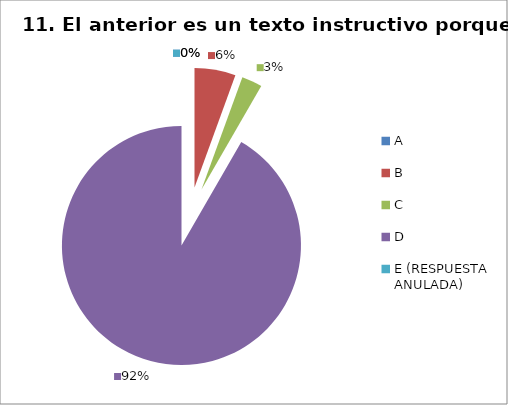
| Category | CANTIDAD DE RESPUESTAS PREGUNTA (11) | PORCENTAJE |
|---|---|---|
| A | 0 | 0 |
| B | 2 | 0.056 |
| C | 1 | 0.028 |
| D | 33 | 0.917 |
| E (RESPUESTA ANULADA) | 0 | 0 |